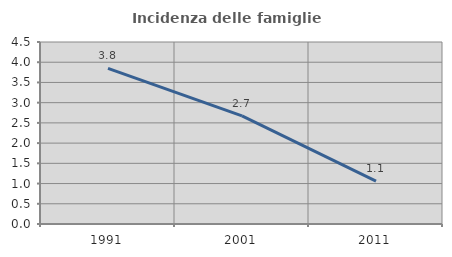
| Category | Incidenza delle famiglie numerose |
|---|---|
| 1991.0 | 3.846 |
| 2001.0 | 2.672 |
| 2011.0 | 1.06 |